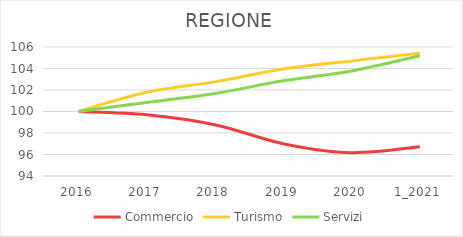
| Category | Commercio | Turismo | Servizi |
|---|---|---|---|
| 2016 | 100 | 100 | 100 |
| 2017 | 99.703 | 101.786 | 100.843 |
| 2018 | 98.775 | 102.757 | 101.671 |
| 2019 | 97.008 | 103.953 | 102.853 |
| 2020 | 96.174 | 104.706 | 103.777 |
| 1_2021 | 96.715 | 105.409 | 105.184 |